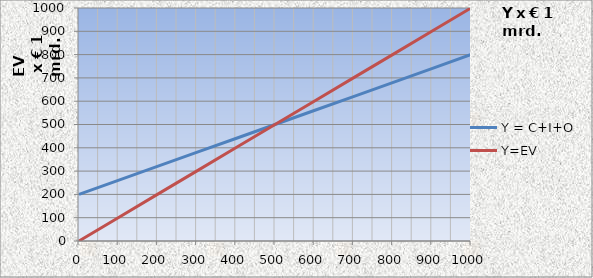
| Category | Y = C+I+O | Y=EV |
|---|---|---|
| 0.0 | 200 | 0 |
| 100.0 | 260 | 100 |
| 200.0 | 320 | 200 |
| 300.0 | 380 | 300 |
| 400.0 | 440 | 400 |
| 500.0 | 500 | 500 |
| 600.0 | 560 | 600 |
| 700.0 | 620 | 700 |
| 800.0 | 680 | 800 |
| 900.0 | 740 | 900 |
| 1000.0 | 800 | 1000 |